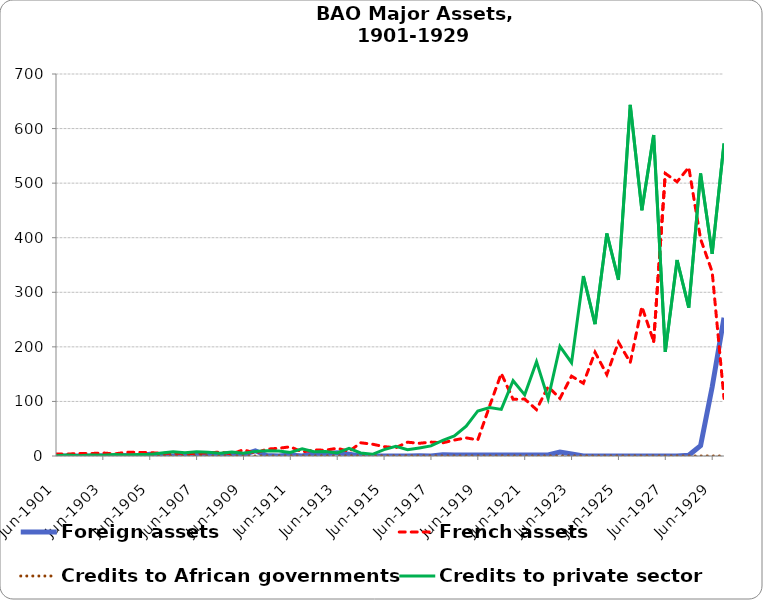
| Category | Foreign assets | French assets | Credits to African governments | Credits to private sector |
|---|---|---|---|---|
| 1901-06-30 | 0 | 3.718 | 0 | 0.551 |
| 1901-12-31 | 0 | 3.567 | 0 | 2.049 |
| 1902-06-30 | 0 | 4.603 | 0 | 0.648 |
| 1902-12-31 | 0.203 | 4.57 | 0 | 1.874 |
| 1903-06-30 | 0.623 | 5.565 | 0 | 1.484 |
| 1903-12-31 | 0.31 | 3.82 | 0 | 2.85 |
| 1904-06-30 | 0.69 | 6.926 | 0 | 1.699 |
| 1904-12-31 | 0 | 6.688 | 0 | 2.76 |
| 1905-06-30 | 2.995 | 6.149 | 0 | 2.916 |
| 1905-12-31 | 0 | 5 | 0 | 5.371 |
| 1906-06-30 | 0.066 | 4.962 | 0 | 7.696 |
| 1906-12-31 | 1.25 | 4.828 | 0 | 5.954 |
| 1907-06-30 | 1.08 | 4.767 | 0 | 7.561 |
| 1907-12-31 | 1.572 | 5.795 | 0 | 6.957 |
| 1908-06-30 | 2.601 | 7.193 | 0 | 5.17 |
| 1908-12-31 | 2.59 | 3.96 | 0 | 7.198 |
| 1909-06-30 | 2.697 | 11.437 | 0 | 4.937 |
| 1909-12-31 | 9.53 | 5.213 | 0 | 8.442 |
| 1910-06-30 | 0.805 | 12.597 | 0 | 9.582 |
| 1910-12-31 | 0.05 | 14.133 | 0 | 9.234 |
| 1911-06-30 | 2.015 | 16.908 | 0 | 6.532 |
| 1911-12-31 | 0.03 | 7.342 | 0 | 13.229 |
| 1912-06-30 | 4.675 | 11.01 | 0 | 7.763 |
| 1912-12-31 | 4 | 10.615 | 0 | 8.169 |
| 1913-06-30 | 5.876 | 14.272 | 0 | 5.574 |
| 1913-12-31 | 3.3 | 8.321 | 0 | 14.054 |
| 1914-06-30 | 0.075 | 24.237 | 0 | 5.505 |
| 1914-12-31 | 0 | 21.661 | 0 | 3.171 |
| 1915-06-30 | 0 | 17.12 | 0 | 11.734 |
| 1915-12-31 | 0 | 15.268 | 0 | 17.748 |
| 1916-06-30 | 0 | 25.282 | 0 | 11.356 |
| 1916-12-31 | 0.5 | 23.292 | 0 | 14.721 |
| 1917-06-30 | 0 | 25.497 | 0 | 18.489 |
| 1917-12-31 | 2.107 | 24.16 | 0 | 28.767 |
| 1918-06-30 | 1.857 | 29.242 | 0 | 36.656 |
| 1918-12-31 | 2.039 | 33.247 | 0 | 54.536 |
| 1919-06-30 | 1.796 | 29.374 | 0 | 82.572 |
| 1919-12-31 | 1.796 | 91.631 | 0 | 88.886 |
| 1920-06-30 | 1.796 | 151.309 | 0 | 85.413 |
| 1920-12-31 | 1.796 | 103.86 | 0 | 137.944 |
| 1921-06-30 | 1.796 | 104.307 | 0 | 112.076 |
| 1921-12-31 | 1.796 | 84.967 | 0 | 172.848 |
| 1922-06-30 | 1.796 | 127.214 | 0 | 104.836 |
| 1922-12-31 | 7.331 | 105.512 | 0 | 200.907 |
| 1923-06-30 | 3.687 | 146.334 | 0 | 170.997 |
| 1923-12-31 | 0 | 133.233 | 0 | 329.816 |
| 1924-06-30 | 0 | 190.166 | 0 | 241.749 |
| 1924-12-31 | 0 | 149.246 | 0 | 407.718 |
| 1925-06-30 | 0 | 208.572 | 0 | 322.797 |
| 1925-12-31 | 0 | 171.344 | 0 | 643.446 |
| 1926-06-30 | 0 | 273.685 | 0 | 450.343 |
| 1926-12-31 | 0 | 210.079 | 0 | 588.035 |
| 1927-06-30 | 0 | 517.755 | 0 | 190.83 |
| 1927-12-31 | 0 | 502.451 | 0 | 359.145 |
| 1928-06-30 | 1.266 | 529.014 | 0 | 271.878 |
| 1928-12-31 | 18.829 | 397.679 | 0 | 517.681 |
| 1929-06-30 | 126.664 | 337.31 | 0 | 370.447 |
| 1929-12-31 | 253.407 | 105.524 | 0 | 572.708 |